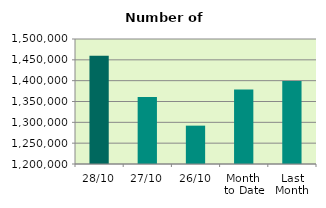
| Category | Series 0 |
|---|---|
| 28/10 | 1459906 |
| 27/10 | 1360946 |
| 26/10 | 1292030 |
| Month 
to Date | 1378925.9 |
| Last
Month | 1399299.909 |